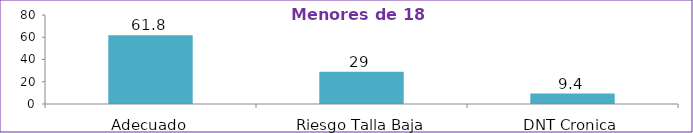
| Category | Series 0 |
|---|---|
| Adecuado | 61.8 |
| Riesgo Talla Baja | 29 |
| DNT Cronica | 9.4 |